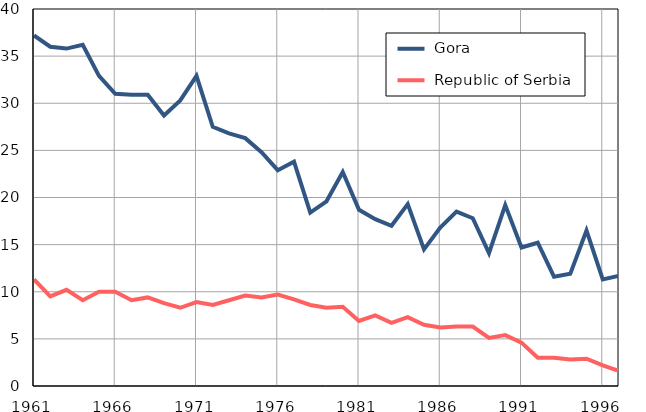
| Category |  Gora |  Republic of Serbia |
|---|---|---|
| 1961.0 | 37.2 | 11.3 |
| 1962.0 | 36 | 9.5 |
| 1963.0 | 35.8 | 10.2 |
| 1964.0 | 36.2 | 9.1 |
| 1965.0 | 32.9 | 10 |
| 1966.0 | 31 | 10 |
| 1967.0 | 30.9 | 9.1 |
| 1968.0 | 30.9 | 9.4 |
| 1969.0 | 28.7 | 8.8 |
| 1970.0 | 30.3 | 8.3 |
| 1971.0 | 32.9 | 8.9 |
| 1972.0 | 27.5 | 8.6 |
| 1973.0 | 26.8 | 9.1 |
| 1974.0 | 26.3 | 9.6 |
| 1975.0 | 24.8 | 9.4 |
| 1976.0 | 22.9 | 9.7 |
| 1977.0 | 23.8 | 9.2 |
| 1978.0 | 18.4 | 8.6 |
| 1979.0 | 19.6 | 8.3 |
| 1980.0 | 22.7 | 8.4 |
| 1981.0 | 18.7 | 6.9 |
| 1982.0 | 17.7 | 7.5 |
| 1983.0 | 17 | 6.7 |
| 1984.0 | 19.3 | 7.3 |
| 1985.0 | 14.5 | 6.5 |
| 1986.0 | 16.8 | 6.2 |
| 1987.0 | 18.5 | 6.3 |
| 1988.0 | 17.8 | 6.3 |
| 1989.0 | 14.1 | 5.1 |
| 1990.0 | 19.2 | 5.4 |
| 1991.0 | 14.7 | 4.6 |
| 1992.0 | 15.2 | 3 |
| 1993.0 | 11.6 | 3 |
| 1994.0 | 11.9 | 2.8 |
| 1995.0 | 16.5 | 2.9 |
| 1996.0 | 11.3 | 2.2 |
| 1997.0 | 11.7 | 1.6 |